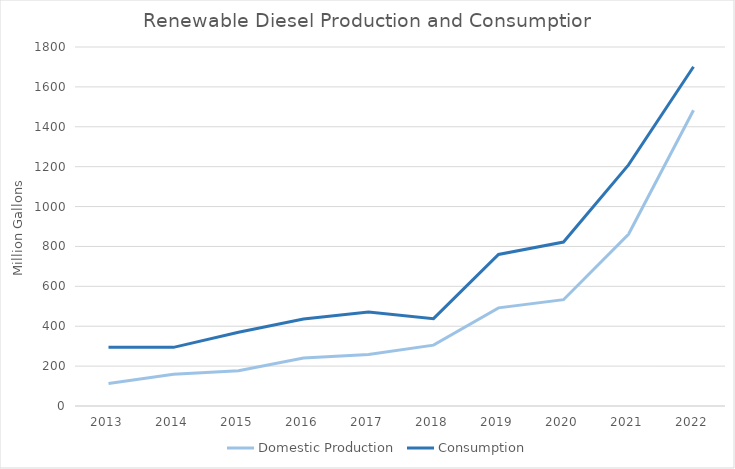
| Category | Domestic Production | Consumption |
|---|---|---|
| 2013.0 | 113 | 295 |
| 2014.0 | 159 | 294 |
| 2015.0 | 177 | 370 |
| 2016.0 | 241 | 436 |
| 2017.0 | 258 | 471 |
| 2018.0 | 305 | 438 |
| 2019.0 | 492 | 760 |
| 2020.0 | 533 | 822 |
| 2021.0 | 861 | 1209 |
| 2022.0 | 1483 | 1701 |